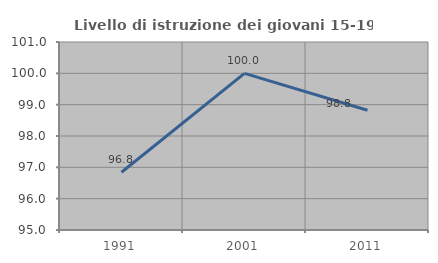
| Category | Livello di istruzione dei giovani 15-19 anni |
|---|---|
| 1991.0 | 96.842 |
| 2001.0 | 100 |
| 2011.0 | 98.824 |